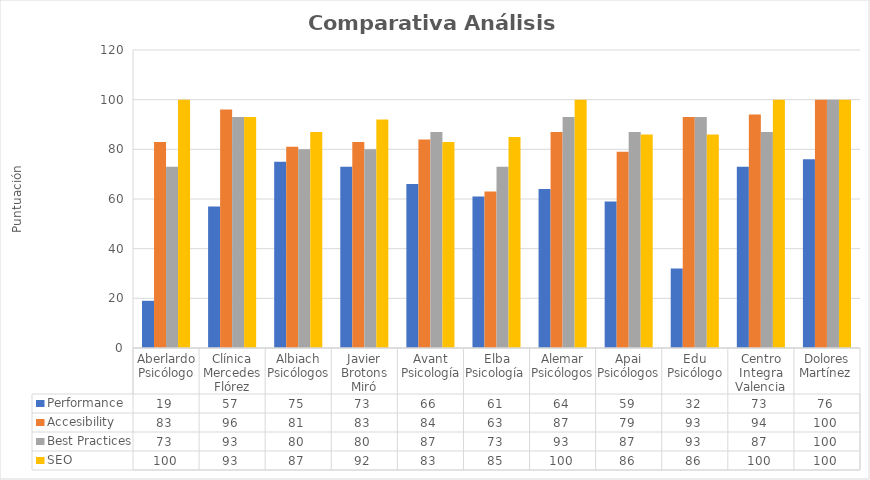
| Category | Performance | Accesibility | Best Practices | SEO |
|---|---|---|---|---|
| Aberlardo Psicólogo | 19 | 83 | 73 | 100 |
| Clínica Mercedes Flórez | 57 | 96 | 93 | 93 |
| Albiach Psicólogos | 75 | 81 | 80 | 87 |
| Javier Brotons Miró | 73 | 83 | 80 | 92 |
| Avant Psicología | 66 | 84 | 87 | 83 |
| Elba Psicología  | 61 | 63 | 73 | 85 |
| Alemar Psicólogos | 64 | 87 | 93 | 100 |
| Apai Psicólogos | 59 | 79 | 87 | 86 |
| Edu Psicólogo | 32 | 93 | 93 | 86 |
| Centro Integra Valencia | 73 | 94 | 87 | 100 |
| Dolores Martínez  | 76 | 100 | 100 | 100 |